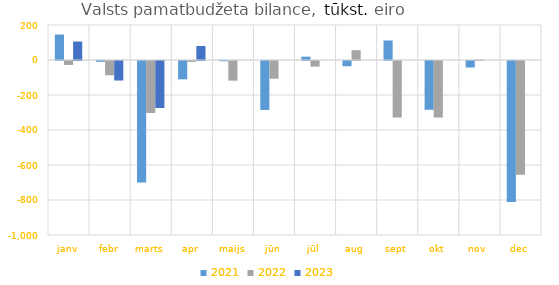
| Category | 2021 | 2022 | 2023 |
|---|---|---|---|
| janv | 145495.451 | -22576.613 | 105353.718 |
| febr | -4522.432 | -81631.044 | -111573.897 |
| marts | -694525.982 | -297136.226 | -268446.374 |
| apr | -104877.798 | -5088.903 | 80162.835 |
| maijs | -1156.411 | -112366.131 | 0 |
| jūn | -279832.241 | -101334.812 | 0 |
| jūl | 19028.311 | -31986.255 | 0 |
| aug | -30047.233 | 56068.97 | 0 |
| sept | 111497.077 | -323095.809 | 0 |
| okt | -278801.691 | -323290.39 | 0 |
| nov | -37283.727 | 2508.419 | 0 |
| dec | -805850.118 | -649319.296 | 0 |